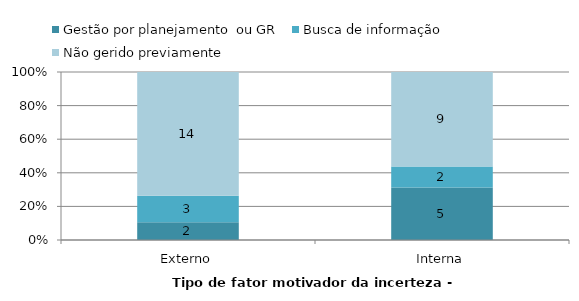
| Category | Gestão por planejamento  ou GR | Busca de informação | Não gerido previamente |
|---|---|---|---|
| Externo | 2 | 3 | 14 |
| Interna | 5 | 2 | 9 |